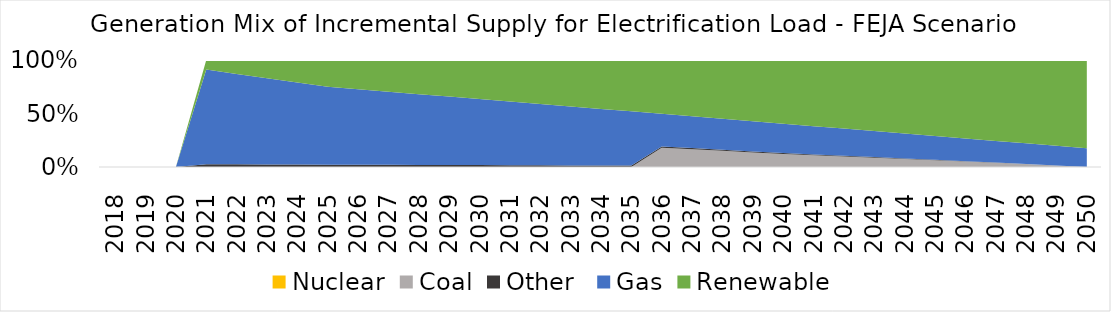
| Category | Nuclear | Coal | Other  | Gas | Renewable |
|---|---|---|---|---|---|
| 2018.0 | 0 | 0 | 0 | 0 | 0 |
| 2019.0 | 0 | 0 | 0 | 0 | 0 |
| 2020.0 | 0 | 0 | 0 | 0 | 0 |
| 2021.0 | 0 | 0 | 0.025 | 0.885 | 0.09 |
| 2022.0 | 0 | 0 | 0.025 | 0.846 | 0.13 |
| 2023.0 | 0 | 0 | 0.024 | 0.806 | 0.17 |
| 2024.0 | 0 | 0 | 0.023 | 0.767 | 0.21 |
| 2025.0 | 0 | 0 | 0.022 | 0.728 | 0.25 |
| 2026.0 | 0 | 0 | 0.021 | 0.706 | 0.273 |
| 2027.0 | 0 | 0 | 0.02 | 0.684 | 0.296 |
| 2028.0 | 0 | 0 | 0.019 | 0.662 | 0.319 |
| 2029.0 | 0 | 0 | 0.018 | 0.64 | 0.342 |
| 2030.0 | 0 | 0 | 0.018 | 0.617 | 0.365 |
| 2031.0 | 0 | 0 | 0.017 | 0.595 | 0.388 |
| 2032.0 | 0 | 0 | 0.016 | 0.573 | 0.411 |
| 2033.0 | 0 | 0 | 0.015 | 0.551 | 0.434 |
| 2034.0 | 0 | 0 | 0.014 | 0.529 | 0.457 |
| 2035.0 | 0 | 0 | 0.013 | 0.507 | 0.48 |
| 2036.0 | 0 | 0.18 | 0.012 | 0.305 | 0.503 |
| 2037.0 | 0 | 0.165 | 0.011 | 0.297 | 0.526 |
| 2038.0 | 0 | 0.151 | 0.011 | 0.29 | 0.549 |
| 2039.0 | 0 | 0.136 | 0.01 | 0.282 | 0.572 |
| 2040.0 | 0 | 0.122 | 0.009 | 0.274 | 0.595 |
| 2041.0 | 0 | 0.11 | 0.008 | 0.264 | 0.618 |
| 2042.0 | 0 | 0.098 | 0.007 | 0.254 | 0.641 |
| 2043.0 | 0 | 0.086 | 0.006 | 0.244 | 0.664 |
| 2044.0 | 0 | 0.074 | 0.005 | 0.233 | 0.687 |
| 2045.0 | 0 | 0.063 | 0.004 | 0.223 | 0.71 |
| 2046.0 | 0 | 0.051 | 0.004 | 0.213 | 0.733 |
| 2047.0 | 0 | 0.039 | 0.003 | 0.203 | 0.756 |
| 2048.0 | 0 | 0.027 | 0.002 | 0.192 | 0.779 |
| 2049.0 | 0 | 0.013 | 0.001 | 0.184 | 0.802 |
| 2050.0 | 0 | 0 | 0 | 0.175 | 0.825 |